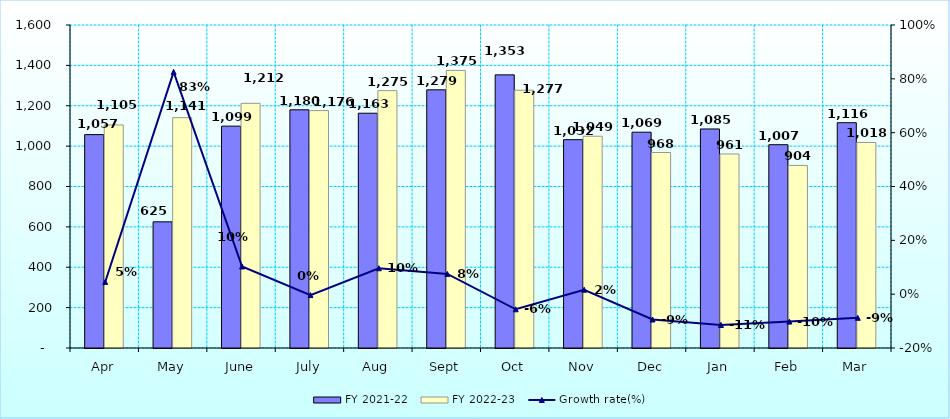
| Category | FY 2021-22 | FY 2022-23 |
|---|---|---|
| Apr | 1057 | 1105 |
| May | 625 | 1141 |
| June | 1099 | 1212 |
| July | 1180 | 1176 |
| Aug | 1163 | 1275 |
| Sept | 1279 | 1375 |
| Oct | 1353 | 1277 |
| Nov | 1032 | 1049 |
| Dec | 1069 | 968.37 |
| Jan | 1085 | 961 |
| Feb | 1007 | 904.358 |
| Mar | 1116 | 1018 |